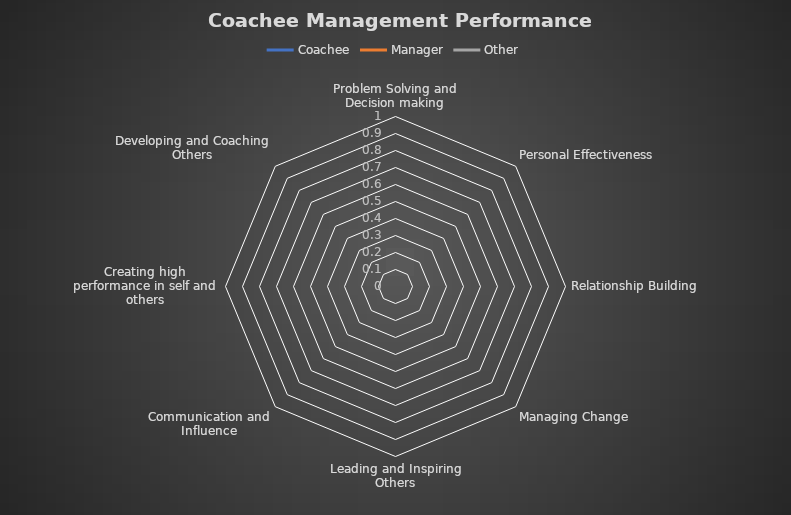
| Category | Coachee | Manager | Other |
|---|---|---|---|
| Problem Solving and Decision making | 0 | 0 | 0 |
| Personal Effectiveness | 0 | 0 | 0 |
| Relationship Building | 0 | 0 | 0 |
| Managing Change | 0 | 0 | 0 |
| Leading and Inspiring Others | 0 | 0 | 0 |
| Communication and Influence | 0 | 0 | 0 |
| Creating high performance in self and others | 0 | 0 | 0 |
| Developing and Coaching Others | 0 | 0 | 0 |